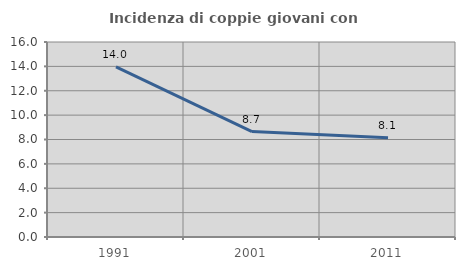
| Category | Incidenza di coppie giovani con figli |
|---|---|
| 1991.0 | 13.953 |
| 2001.0 | 8.654 |
| 2011.0 | 8.14 |